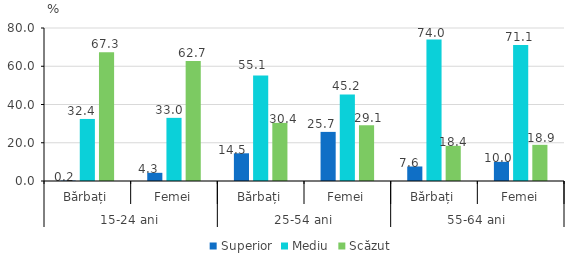
| Category | Superior | Mediu | Scăzut |
|---|---|---|---|
| 0 | 0.234 | 32.441 | 67.324 |
| 1 | 4.276 | 33.016 | 62.708 |
| 2 | 14.489 | 55.117 | 30.394 |
| 3 | 25.676 | 45.23 | 29.094 |
| 4 | 7.594 | 74.007 | 18.399 |
| 5 | 10.017 | 71.072 | 18.911 |